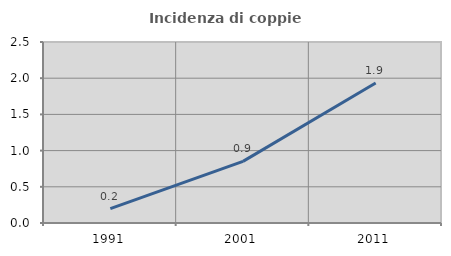
| Category | Incidenza di coppie miste |
|---|---|
| 1991.0 | 0.199 |
| 2001.0 | 0.851 |
| 2011.0 | 1.935 |